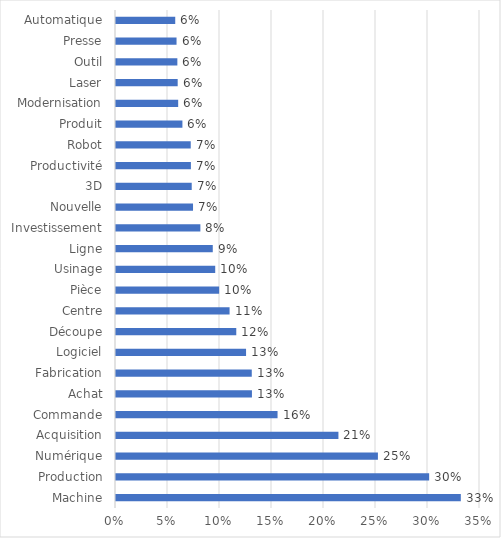
| Category | Apparition moyenne par projets |
|---|---|
| Machine | 0.332 |
| Production | 0.301 |
| Numérique | 0.252 |
| Acquisition | 0.214 |
| Commande | 0.155 |
| Achat | 0.131 |
| Fabrication | 0.131 |
| Logiciel | 0.125 |
| Découpe | 0.116 |
| Centre | 0.109 |
| Pièce | 0.099 |
| Usinage | 0.095 |
| Ligne | 0.093 |
| Investissement | 0.081 |
| Nouvelle | 0.074 |
| 3D | 0.073 |
| Productivité | 0.072 |
| Robot | 0.072 |
| Produit | 0.064 |
| Modernisation | 0.06 |
| Laser | 0.059 |
| Outil | 0.059 |
| Presse | 0.058 |
| Automatique | 0.057 |